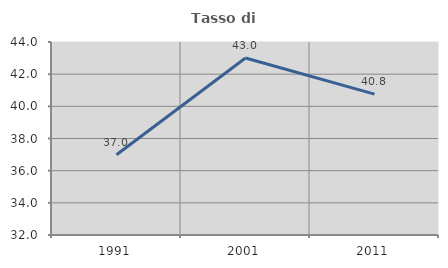
| Category | Tasso di occupazione   |
|---|---|
| 1991.0 | 36.99 |
| 2001.0 | 43.005 |
| 2011.0 | 40.762 |